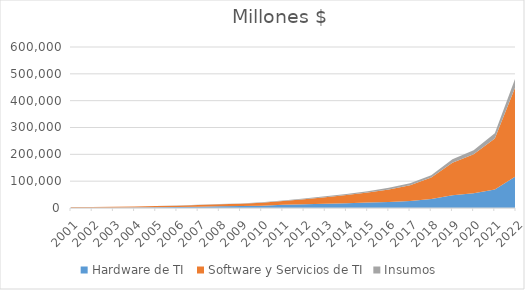
| Category | Hardware de TI  | Software y Servicios de TI | Insumos  |
|---|---|---|---|
| 2001.0 | 1100 | 2270 | 320 |
| 2002.0 | 720 | 2900 | 350 |
| 2003.0 | 1240 | 3110 | 410 |
| 2004.0 | 2100 | 3340 | 460 |
| 2005.0 | 3140 | 3880 | 610 |
| 2006.0 | 3850 | 4840 | 810 |
| 2007.0 | 5100 | 5910 | 990 |
| 2008.0 | 6267 | 7350 | 1233 |
| 2009.0 | 7193 | 8600 | 1410 |
| 2010.0 | 8775 | 10936 | 1833 |
| 2011.0 | 11906 | 14069 | 2346 |
| 2012.0 | 13692 | 18806 | 2909 |
| 2013.0 | 15746 | 24203 | 3549 |
| 2014.0 | 18108 | 30253 | 4259 |
| 2015.0 | 20462 | 37211 | 5111 |
| 2016.0 | 22303 | 46490 | 6236 |
| 2017.0 | 26318 | 58350 | 7545 |
| 2018.0 | 33424 | 79788 | 9280 |
| 2019.0 | 47796 | 120855 | 12900 |
| 2020.0 | 54965 | 145026 | 15480 |
| 2021.0 | 69256 | 189915 | 19659 |
| 2022.0 | 119120 | 338350 | 32831 |